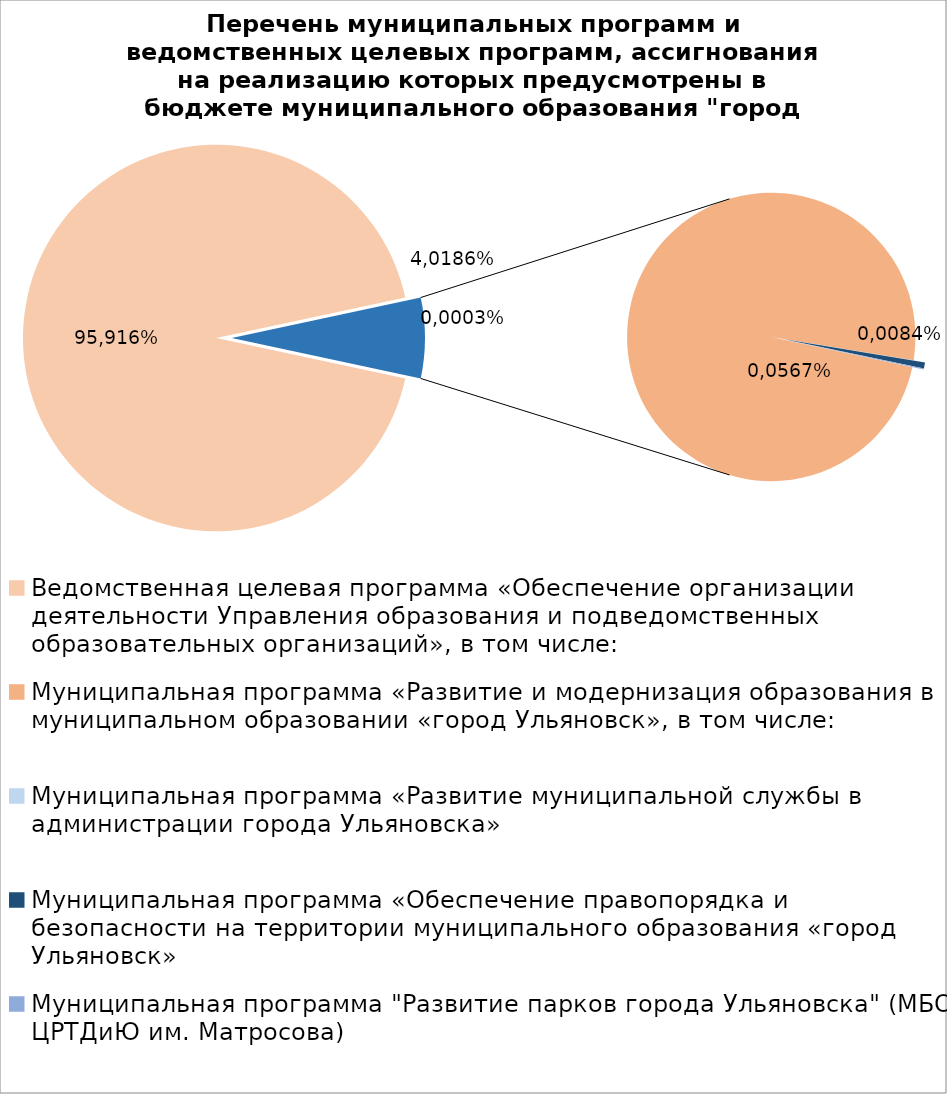
| Category | Series 0 |
|---|---|
| Ведомственная целевая программа «Обеспечение организации деятельности Управления образования и подведомственных образовательных организаций», в том числе: | 5671416.33 |
| Муниципальная программа «Развитие и модернизация образования в муниципальном образовании «город Ульяновск», в том числе: | 405108.34 |
| Муниципальная программа «Развитие муниципальной службы в администрации города Ульяновска» | 15.4 |
| Муниципальная программа «Обеспечение правопорядка и безопасности на территории муниципального образования «город Ульяновск» | 2700 |
| Муниципальная программа "Развитие парков города Ульяновска" (МБОУ ЦРТДиЮ им. Матросова) | 400 |